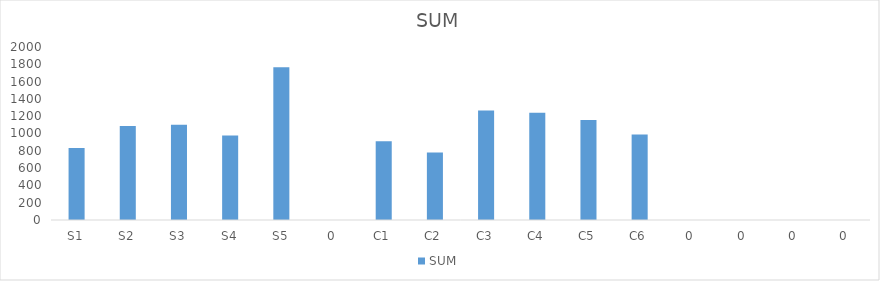
| Category | SUM |
|---|---|
| S1 | 831 |
| S2 | 1086 |
| S3 | 1100 |
| S4 | 978 |
| S5 | 1765 |
| 0 | 0 |
| C1 | 909 |
| C2 | 779 |
| C3 | 1265 |
| C4 | 1239 |
| C5 | 1155 |
| C6 | 989 |
| 0 | 0 |
| 0 | 0 |
| 0 | 0 |
| 0 | 0 |